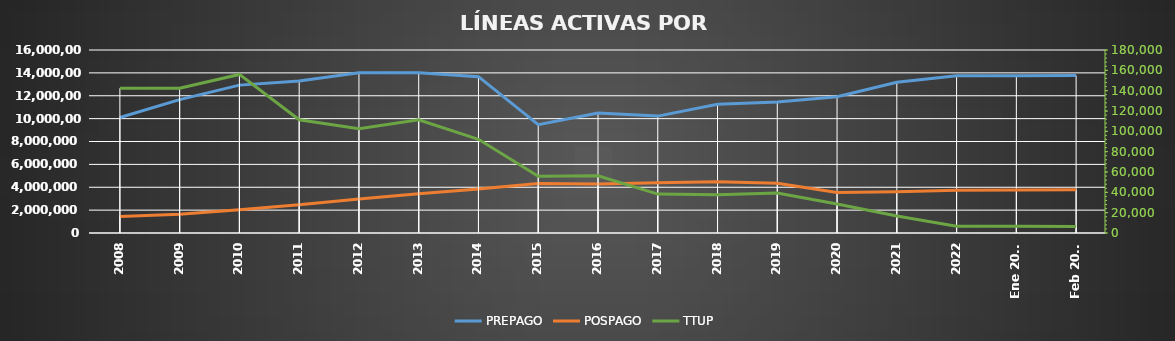
| Category | PREPAGO | POSPAGO |
|---|---|---|
| 2008 | 10097768 | 1452088 |
| 2009 | 11662294 | 1649838 |
| 2010 | 12929040 | 2033814 |
| 2011 | 13295834 | 2467378 |
| 2012 | 14008104 | 2976194 |
| 2013 | 14005126 | 3425277 |
| 2014 | 13666071 | 3846271 |
| 2015 | 9476240 | 4326937 |
| 2016 | 10498467 | 4293426 |
| 2017 | 10219457 | 4393703 |
| 2018 | 11254168 | 4480975 |
| 2019 | 11462048 | 4351686 |
| 2020 | 11917697 | 3539192 |
| 2021 | 13174530 | 3598383 |
| 2022 | 13740159 | 3743849 |
| Ene 2023 | 13744592 | 3762200 |
| Feb 2023 | 13771967 | 3773530 |